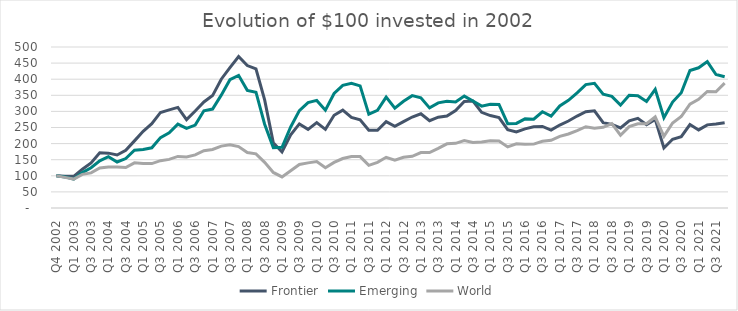
| Category | Frontier | Emerging | World |
|---|---|---|---|
| Q4 2002 | 100 | 100 | 100 |
| Q4 2002 | 98.422 | 96.603 | 95.05 |
| Q1 2003 | 98.306 | 90.048 | 89.821 |
| Q2 2003 | 120.483 | 110.028 | 104.511 |
| Q3 2003 | 140.026 | 124.894 | 109.139 |
| Q4 2003 | 171.246 | 146.441 | 124.338 |
| Q1 2004 | 170.322 | 159.432 | 127.078 |
| Q2 2004 | 164.577 | 142.942 | 127.48 |
| Q3 2004 | 179.111 | 153.509 | 125.723 |
| Q4 2004 | 208.454 | 179.313 | 140.298 |
| Q1 2005 | 238.291 | 181.469 | 138.119 |
| Q2 2005 | 261.767 | 186.92 | 137.835 |
| Q3 2005 | 296.774 | 218.719 | 146.893 |
| Q4 2005 | 304.612 | 233.655 | 150.909 |
| Q1 2006 | 312.498 | 260.55 | 160.182 |
| Q2 2006 | 274.445 | 247.235 | 158.366 |
| Q3 2006 | 301.216 | 257.362 | 164.777 |
| Q4 2006 | 329.356 | 301.842 | 178 |
| Q1 2007 | 349.126 | 307.26 | 181.672 |
| Q2 2007 | 400.008 | 350.473 | 192.252 |
| Q3 2007 | 435.944 | 398.498 | 195.997 |
| Q4 2007 | 470.31 | 411.956 | 190.625 |
| Q1 2008 | 442.341 | 365.319 | 172.46 |
| Q2 2008 | 432.094 | 359.545 | 168.228 |
| Q3 2008 | 335.608 | 260.259 | 141.87 |
| Q4 2008 | 202.248 | 187.538 | 110.409 |
| Q1 2009 | 173.877 | 188.507 | 96.611 |
| Q2 2009 | 226.989 | 251.786 | 115.667 |
| Q3 2009 | 261.144 | 302.305 | 135.215 |
| Q4 2009 | 244.32 | 327.249 | 140.193 |
| Q1 2010 | 265.423 | 334.148 | 144.04 |
| Q2 2010 | 244.139 | 303.608 | 124.938 |
| Q3 2010 | 288.012 | 355.712 | 141.48 |
| Q4 2010 | 303.919 | 380.798 | 153.583 |
| Q1 2011 | 281.566 | 387.244 | 160.165 |
| Q2 2011 | 273.992 | 379.091 | 159.715 |
| Q3 2011 | 241.724 | 291.186 | 132.465 |
| Q4 2011 | 241.562 | 303.079 | 141.888 |
| Q1 2012 | 267.97 | 344.44 | 157.415 |
| Q2 2012 | 253.673 | 310.011 | 148.262 |
| Q3 2012 | 268.097 | 331.611 | 157.354 |
| Q4 2012 | 282.491 | 348.988 | 160.594 |
| Q1 2013 | 292.586 | 342.274 | 172.113 |
| Q2 2013 | 270.983 | 310.997 | 171.998 |
| Q3 2013 | 282.09 | 326.584 | 185.21 |
| Q4 2013 | 285.822 | 331.621 | 199.296 |
| Q1 2014 | 302.572 | 328.962 | 200.831 |
| Q2 2014 | 330.602 | 347.526 | 209.176 |
| Q3 2014 | 332.298 | 332.494 | 203.776 |
| Q4 2014 | 297.093 | 316.282 | 205.127 |
| Q1 2015 | 287.025 | 322.321 | 208.863 |
| Q2 2015 | 281.04 | 321.554 | 208.239 |
| Q3 2015 | 243.375 | 261.956 | 189.799 |
| Q4 2015 | 236.449 | 262.647 | 199.502 |
| Q1 2016 | 245.756 | 276.756 | 197.742 |
| Q2 2016 | 252.548 | 275.863 | 198.355 |
| Q3 2016 | 253.146 | 298.803 | 207.046 |
| Q4 2016 | 241.833 | 285.18 | 210.112 |
| Q1 2017 | 257.591 | 316.963 | 222.406 |
| Q2 2017 | 270.068 | 334.303 | 229.934 |
| Q3 2017 | 285.542 | 357.759 | 240.027 |
| Q4 2017 | 298.826 | 383.136 | 252.373 |
| Q1 2018 | 301.897 | 387.247 | 247.98 |
| Q2 2018 | 264.982 | 353.724 | 250.675 |
| Q3 2018 | 259.658 | 346.577 | 262.038 |
| Q4 2018 | 248.708 | 319.414 | 226.031 |
| Q1 2019 | 270.832 | 349.957 | 252.887 |
| Q2 2019 | 278.587 | 348.876 | 261.359 |
| Q3 2019 | 258.797 | 331.062 | 261.56 |
| Q4 2019 | 275.256 | 368.653 | 282.97 |
| Q1 2020 | 186.283 | 280.652 | 222.291 |
| Q2 2020 | 213.403 | 329.111 | 264.171 |
| Q3 2020 | 221.413 | 357.852 | 284.026 |
| Q4 2020 | 259.186 | 427.06 | 322.752 |
| Q1 2021 | 242.479 | 435.385 | 337.349 |
| Q2 2021 | 258.146 | 454.637 | 362.008 |
| Q3 2021 | 260.7 | 414.44 | 360.733 |
| Q4 2021 | 264.92 | 407.465 | 387.744 |